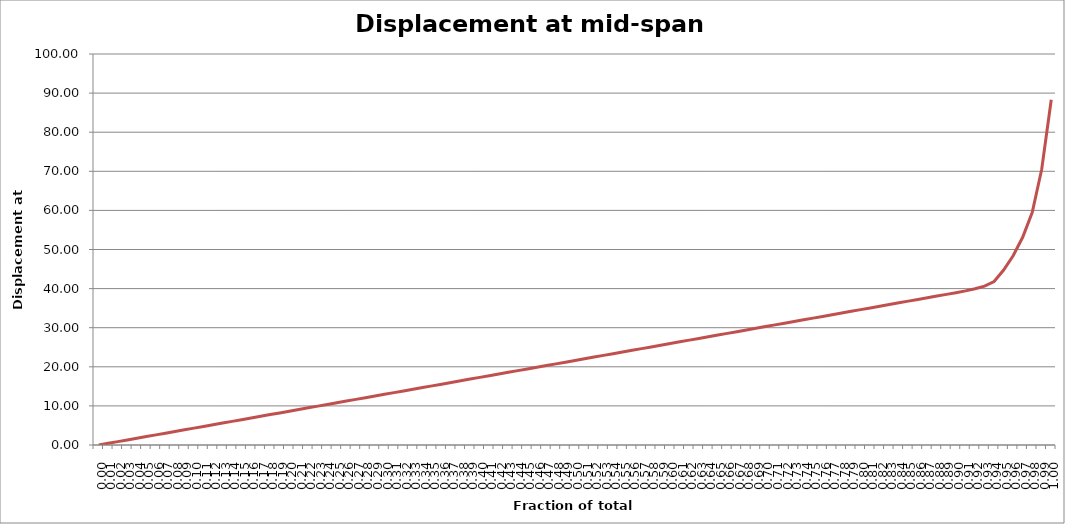
| Category | Displacement at mid-span [mm] |
|---|---|
| 0.0 | 0 |
| 0.01 | 0.432 |
| 0.02 | 0.864 |
| 0.03 | 1.295 |
| 0.04 | 1.727 |
| 0.05 | 2.159 |
| 0.06 | 2.591 |
| 0.06999999999999999 | 3.023 |
| 0.08 | 3.455 |
| 0.09 | 3.887 |
| 0.1 | 4.319 |
| 0.11000000000000001 | 4.751 |
| 0.12 | 5.183 |
| 0.13 | 5.615 |
| 0.13999999999999999 | 6.047 |
| 0.15 | 6.479 |
| 0.16 | 6.911 |
| 0.16999999999999998 | 7.344 |
| 0.18 | 7.776 |
| 0.19 | 8.208 |
| 0.2 | 8.64 |
| 0.21000000000000002 | 9.073 |
| 0.22000000000000003 | 9.505 |
| 0.22999999999999998 | 9.937 |
| 0.24 | 10.37 |
| 0.25 | 10.802 |
| 0.26 | 11.234 |
| 0.27 | 11.667 |
| 0.27999999999999997 | 12.099 |
| 0.29 | 12.532 |
| 0.3 | 12.964 |
| 0.31 | 13.397 |
| 0.32 | 13.83 |
| 0.32999999999999996 | 14.262 |
| 0.33999999999999997 | 14.695 |
| 0.35 | 15.127 |
| 0.36 | 15.56 |
| 0.37 | 15.993 |
| 0.38 | 16.426 |
| 0.39 | 16.858 |
| 0.4 | 17.291 |
| 0.41 | 17.724 |
| 0.42000000000000004 | 18.157 |
| 0.43 | 18.59 |
| 0.44000000000000006 | 19.022 |
| 0.45 | 19.455 |
| 0.45999999999999996 | 19.888 |
| 0.47000000000000003 | 20.321 |
| 0.48 | 20.754 |
| 0.49000000000000005 | 21.187 |
| 0.5 | 21.62 |
| 0.51 | 22.053 |
| 0.52 | 22.486 |
| 0.53 | 22.92 |
| 0.54 | 23.353 |
| 0.55 | 23.786 |
| 0.5599999999999999 | 24.219 |
| 0.5700000000000001 | 24.652 |
| 0.58 | 25.085 |
| 0.5900000000000001 | 25.519 |
| 0.6 | 25.952 |
| 0.61 | 26.385 |
| 0.62 | 26.819 |
| 0.63 | 27.252 |
| 0.64 | 27.685 |
| 0.65 | 28.119 |
| 0.6599999999999999 | 28.552 |
| 0.67 | 28.985 |
| 0.6799999999999999 | 29.419 |
| 0.6900000000000001 | 29.852 |
| 0.7 | 30.286 |
| 0.71 | 30.719 |
| 0.72 | 31.153 |
| 0.73 | 31.587 |
| 0.74 | 32.02 |
| 0.75 | 32.454 |
| 0.76 | 32.887 |
| 0.77 | 33.321 |
| 0.78 | 33.755 |
| 0.79 | 34.188 |
| 0.8 | 34.622 |
| 0.8099999999999999 | 35.056 |
| 0.82 | 35.49 |
| 0.8300000000000001 | 35.924 |
| 0.8400000000000001 | 36.357 |
| 0.85 | 36.791 |
| 0.86 | 37.225 |
| 0.8699999999999999 | 37.659 |
| 0.8800000000000001 | 38.093 |
| 0.89 | 38.527 |
| 0.9 | 38.961 |
| 0.9099999999999999 | 39.414 |
| 0.9199999999999999 | 39.954 |
| 0.93 | 40.646 |
| 0.9400000000000001 | 41.801 |
| 0.95 | 44.74 |
| 0.96 | 48.395 |
| 0.97 | 53.12 |
| 0.9800000000000001 | 59.441 |
| 0.99 | 70.524 |
| 1.0 | 88.298 |